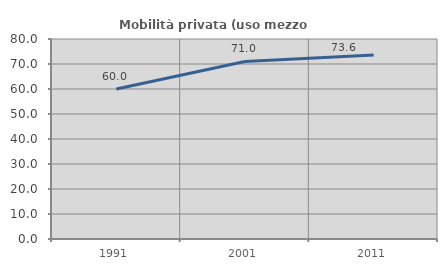
| Category | Mobilità privata (uso mezzo privato) |
|---|---|
| 1991.0 | 60.037 |
| 2001.0 | 71.019 |
| 2011.0 | 73.628 |